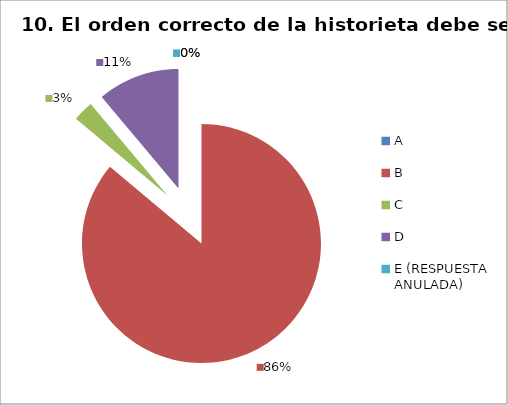
| Category | CANTIDAD DE RESPUESTAS PREGUNTA (10) | PORCENTAJE |
|---|---|---|
| A | 0 | 0 |
| B | 31 | 0.861 |
| C | 1 | 0.028 |
| D | 4 | 0.111 |
| E (RESPUESTA ANULADA) | 0 | 0 |